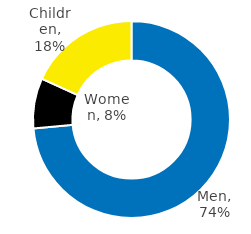
| Category | Series 0 |
|---|---|
| Men | 0.736 |
| Women | 0.082 |
| Children | 0.182 |